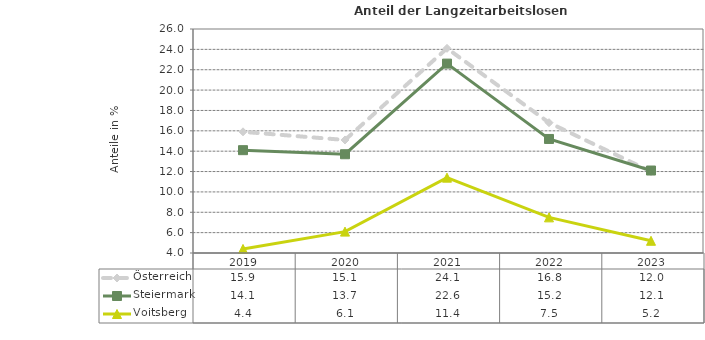
| Category | Österreich | Steiermark | Voitsberg |
|---|---|---|---|
| 2023.0 | 12 | 12.1 | 5.2 |
| 2022.0 | 16.8 | 15.2 | 7.5 |
| 2021.0 | 24.1 | 22.6 | 11.4 |
| 2020.0 | 15.1 | 13.7 | 6.1 |
| 2019.0 | 15.9 | 14.1 | 4.4 |